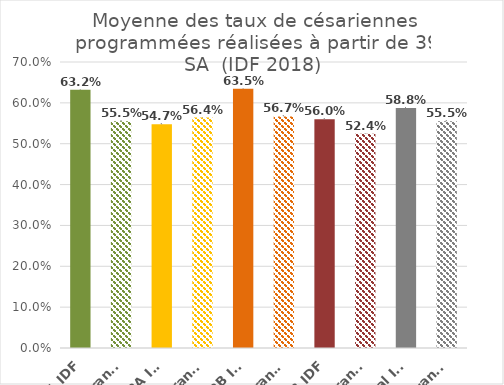
| Category | Series 0 |
|---|---|
| 1 IDF | 0.632 |
| 1 France | 0.555 |
| 2A IDF | 0.547 |
| 2A France | 0.564 |
| 2B IDF | 0.635 |
| 2B France | 0.567 |
| 3 IDF | 0.56 |
| 3 France | 0.524 |
| Total IDF | 0.588 |
| Total France | 0.555 |